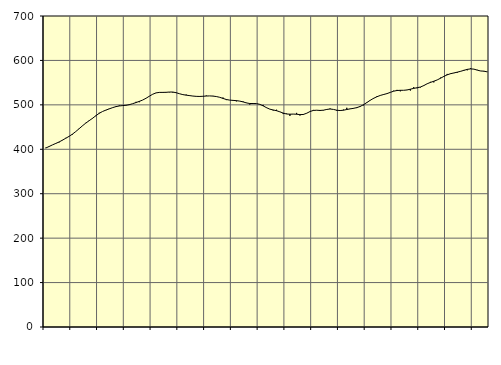
| Category | Piggar | Series 1 |
|---|---|---|
| nan | 403.5 | 402.73 |
| 87.0 | 405.9 | 406.19 |
| 87.0 | 409.8 | 409.79 |
| 87.0 | 413.7 | 413.06 |
| nan | 415.5 | 416.46 |
| 88.0 | 421 | 420.46 |
| 88.0 | 425.7 | 424.79 |
| 88.0 | 428.8 | 429.15 |
| nan | 433 | 434.12 |
| 89.0 | 439.9 | 439.92 |
| 89.0 | 445.8 | 446.35 |
| 89.0 | 452.6 | 452.87 |
| nan | 459.5 | 458.97 |
| 90.0 | 463.7 | 464.39 |
| 90.0 | 469.1 | 469.7 |
| 90.0 | 474.7 | 475.55 |
| nan | 482.1 | 480.97 |
| 91.0 | 485.1 | 485.08 |
| 91.0 | 487.8 | 488.24 |
| 91.0 | 491.6 | 490.96 |
| nan | 494 | 493.7 |
| 92.0 | 496.7 | 496.02 |
| 92.0 | 498.7 | 497.5 |
| 92.0 | 497.9 | 498.36 |
| nan | 499.4 | 499.01 |
| 93.0 | 501.4 | 500.41 |
| 93.0 | 502.6 | 502.66 |
| 93.0 | 506.8 | 505.19 |
| nan | 506 | 507.84 |
| 94.0 | 510.9 | 510.87 |
| 94.0 | 514.8 | 514.85 |
| 94.0 | 519.3 | 519.55 |
| nan | 523.8 | 523.92 |
| 95.0 | 527.2 | 526.95 |
| 95.0 | 528.5 | 528.04 |
| 95.0 | 527.2 | 528.06 |
| nan | 528.8 | 528.27 |
| 96.0 | 528.3 | 528.85 |
| 96.0 | 527.7 | 528.85 |
| 96.0 | 527.9 | 527.33 |
| nan | 524.9 | 525.05 |
| 97.0 | 522.8 | 523.05 |
| 97.0 | 523.1 | 521.8 |
| 97.0 | 520.1 | 520.84 |
| nan | 519.9 | 519.83 |
| 98.0 | 519.5 | 519.15 |
| 98.0 | 519.8 | 518.92 |
| 98.0 | 519.4 | 519.27 |
| nan | 521 | 519.86 |
| 99.0 | 520.1 | 520.12 |
| 99.0 | 520.1 | 519.74 |
| 99.0 | 518.5 | 518.73 |
| nan | 516.9 | 517.05 |
| 0.0 | 516.4 | 514.48 |
| 0.0 | 510.7 | 512.05 |
| 0.0 | 510.7 | 510.68 |
| nan | 509.5 | 510.07 |
| 1.0 | 507.9 | 509.49 |
| 1.0 | 508.3 | 508.45 |
| 1.0 | 507.6 | 506.61 |
| nan | 504.8 | 504.36 |
| 2.0 | 500.7 | 503.05 |
| 2.0 | 504.1 | 503.01 |
| 2.0 | 503 | 502.9 |
| nan | 501.4 | 501.14 |
| 3.0 | 499.9 | 497.73 |
| 3.0 | 493.1 | 493.64 |
| 3.0 | 490.2 | 490.32 |
| nan | 487.3 | 488.51 |
| 4.0 | 489 | 486.86 |
| 4.0 | 484.5 | 484.3 |
| 4.0 | 479.3 | 481.47 |
| nan | 480.4 | 479.39 |
| 5.0 | 475.2 | 478.99 |
| 5.0 | 479.1 | 479.24 |
| 5.0 | 481.9 | 478.86 |
| nan | 476 | 478.02 |
| 6.0 | 477.3 | 478.34 |
| 6.0 | 481.4 | 481.08 |
| 6.0 | 484.8 | 484.92 |
| nan | 488.6 | 487.45 |
| 7.0 | 488.1 | 487.93 |
| 7.0 | 486.2 | 487.42 |
| 7.0 | 487.4 | 487.97 |
| nan | 490.4 | 489.67 |
| 8.0 | 491.8 | 490.65 |
| 8.0 | 489.7 | 489.75 |
| 8.0 | 486.7 | 487.96 |
| nan | 487.2 | 487.19 |
| 9.0 | 489.3 | 487.94 |
| 9.0 | 493.4 | 489.54 |
| 9.0 | 491.4 | 490.95 |
| nan | 491.5 | 492.17 |
| 10.0 | 492.8 | 493.78 |
| 10.0 | 497.4 | 496.39 |
| 10.0 | 498.8 | 500.36 |
| nan | 505.9 | 505.27 |
| 11.0 | 509.9 | 510.27 |
| 11.0 | 513.7 | 514.67 |
| 11.0 | 519.4 | 518.27 |
| nan | 520.9 | 521.17 |
| 12.0 | 524.1 | 523.28 |
| 12.0 | 525.6 | 525.31 |
| 12.0 | 527.9 | 528.09 |
| nan | 531.9 | 530.78 |
| 13.0 | 533.7 | 532.31 |
| 13.0 | 530.5 | 532.76 |
| 13.0 | 532.8 | 532.8 |
| nan | 533.7 | 533.51 |
| 14.0 | 532.2 | 535.24 |
| 14.0 | 539.8 | 537.12 |
| 14.0 | 537.5 | 538.5 |
| nan | 539.2 | 540.14 |
| 15.0 | 544 | 543.38 |
| 15.0 | 547.3 | 547.43 |
| 15.0 | 551.7 | 550.53 |
| nan | 550.6 | 553.16 |
| 16.0 | 556 | 556.05 |
| 16.0 | 561.2 | 559.9 |
| 16.0 | 564.9 | 564.02 |
| nan | 569.6 | 567.55 |
| 17.0 | 569.5 | 570.13 |
| 17.0 | 571.5 | 571.78 |
| 17.0 | 572.2 | 573.54 |
| nan | 575.1 | 575.44 |
| 18.0 | 578.6 | 577.65 |
| 18.0 | 577.8 | 579.87 |
| 18.0 | 582.4 | 580.98 |
| nan | 580.5 | 580.37 |
| 19.0 | 578.8 | 578.17 |
| 19.0 | 576.4 | 576.24 |
| 19.0 | 575.2 | 575.85 |
| nan | 574.5 | 574.17 |